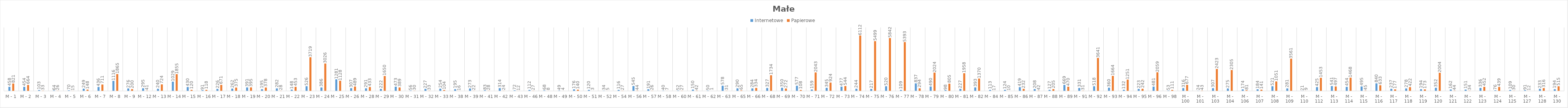
| Category | Internetowe | Papierowe |
|---|---|---|
| M - 1 | 458 | 821 |
| M - 2 | 454 | 664 |
| M - 3 | 103 | 33 |
| M - 4 | 64 | 26 |
| M - 5 | 70 | 15 |
| M - 6 | 249 | 148 |
| M - 7 | 436 | 711 |
| M - 8 | 1116 | 1865 |
| M - 9 | 276 | 200 |
| M - 12 | 295 | 41 |
| M - 13 | 240 | 724 |
| M - 14 | 1029 | 1855 |
| M - 15 | 430 | 120 |
| M - 16 | 91 | 118 |
| M - 17 | 226 | 671 |
| M - 18 | 262 | 375 |
| M - 19 | 391 | 395 |
| M - 20 | 195 | 378 |
| M - 21 | 282 | 28 |
| M - 22 | 148 | 453 |
| M - 23 | 526 | 3719 |
| M - 24 | 386 | 3026 |
| M - 25 | 1281 | 1128 |
| M - 26 | 307 | 489 |
| M - 28 | 291 | 433 |
| M - 29 | 222 | 1650 |
| M - 30 | 473 | 389 |
| M - 31 | 56 | 30 |
| M - 32 | 227 | 33 |
| M - 33 | 254 | 104 |
| M - 38 | 195 | 16 |
| M - 39 | 273 | 22 |
| M - 41 | 83 | 28 |
| M - 42 | 314 | 24 |
| M - 43 | 72 | 12 |
| M - 46 | 112 | 27 |
| M - 48 | 68 | 8 |
| M - 49 | 49 | 4 |
| M - 50 | 176 | 140 |
| M - 51 | 120 | 3 |
| M - 52 | 34 | 5 |
| M - 54 | 116 | 27 |
| M - 56 | 545 | 44 |
| M - 57 | 191 | 26 |
| M - 58 | 40 | 7 |
| M - 60 | 52 | 27 |
| M - 61 | 150 | 42 |
| M - 62 | 50 | 1 |
| M - 63 | 578 | 31 |
| M - 65 | 290 | 65 |
| M - 66 | 284 | 334 |
| M - 68 | 327 | 1734 |
| M - 69 | 350 | 272 |
| M - 70 | 577 | 108 |
| M - 71 | 159 | 2043 |
| M - 72 | 345 | 924 |
| M - 73 | 477 | 544 |
| M - 74 | 244 | 6112 |
| M - 75 | 217 | 5499 |
| M - 76 | 520 | 5842 |
| M - 77 | 109 | 5393 |
| M - 78 | 837 | 294 |
| M - 79 | 490 | 2024 |
| M - 80 | 98 | 805 |
| M - 81 | 227 | 1958 |
| M - 82 | 393 | 1370 |
| M - 84 | 113 | 17 |
| M - 85 | 124 | 10 |
| M - 86 | 419 | 232 |
| M - 87 | 208 | 42 |
| M - 88 | 127 | 205 |
| M - 89 | 669 | 470 |
| M - 91 | 331 | 31 |
| M - 92 | 518 | 3641 |
| M - 93 | 360 | 1664 |
| M - 94 | 132 | 1251 |
| M - 95 | 223 | 242 |
| M - 96 | 481 | 2059 |
| M - 98 | 53 | 111 |
| M - 100 | 316 | 677 |
| M - 101 | 24 | 43 |
| M - 103 | 307 | 2423 |
| M - 104 | 275 | 2305 |
| M - 106 | 174 | 81 |
| M - 107 | 184 | 141 |
| M - 108 | 521 | 1051 |
| M - 109 | 281 | 3561 |
| M - 110 | 21 | 9 |
| M - 112 | 425 | 1453 |
| M - 113 | 541 | 497 |
| M - 114 | 454 | 1468 |
| M - 115 | 495 | 45 |
| M - 116 | 840 | 633 |
| M - 117 | 237 | 177 |
| M - 118 | 278 | 422 |
| M - 119 | 194 | 173 |
| M - 120 | 352 | 2004 |
| M - 121 | 162 | 44 |
| M - 122 | 151 | 34 |
| M - 123 | 336 | 452 |
| M - 124 | 76 | 439 |
| M - 125 | 109 | 30 |
| M - 127 | 91 | 12 |
| M - 128 | 233 | 316 |
| M - 130 | 194 | 515 |